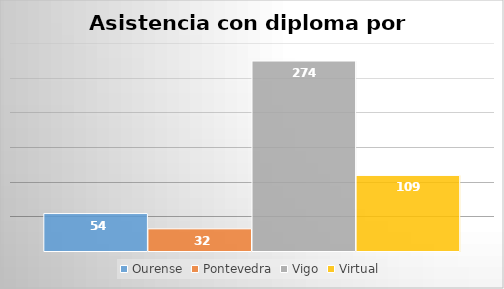
| Category | Ourense | Pontevedra | Vigo | Virtual |
|---|---|---|---|---|
| 0 | 54 | 32 | 274 | 109 |